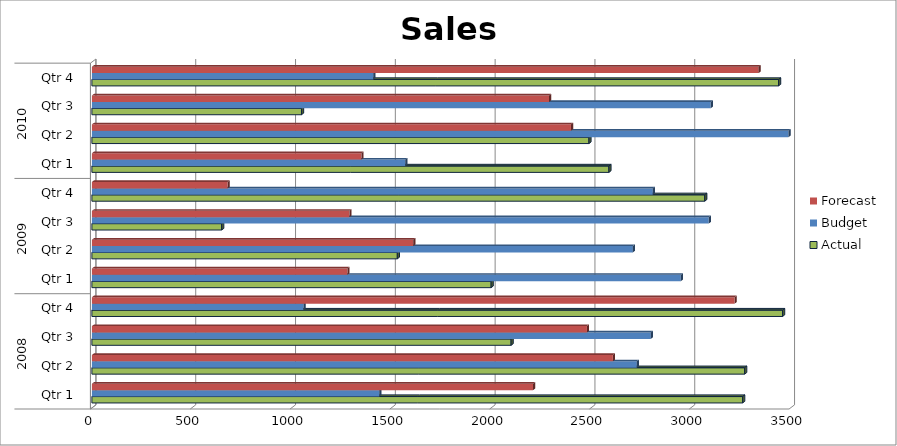
| Category | Actual | Budget | Forecast |
|---|---|---|---|
| 0 | 3260 | 1440 | 2210 |
| 1 | 3270 | 2730 | 2610 |
| 2 | 2100 | 2800 | 2480 |
| 3 | 3460 | 1060 | 3220 |
| 4 | 2000 | 2950 | 1280 |
| 5 | 1530 | 2710 | 1610 |
| 6 | 650 | 3090 | 1290 |
| 7 | 3070 | 2810 | 680 |
| 8 | 2590 | 1570 | 1350 |
| 9 | 2490 | 3490 | 2400 |
| 10 | 1050 | 3100 | 2290 |
| 11 | 3440 | 1410 | 3340 |